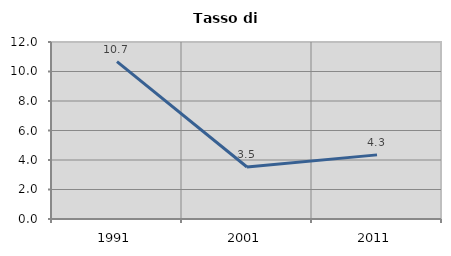
| Category | Tasso di disoccupazione   |
|---|---|
| 1991.0 | 10.667 |
| 2001.0 | 3.524 |
| 2011.0 | 4.348 |